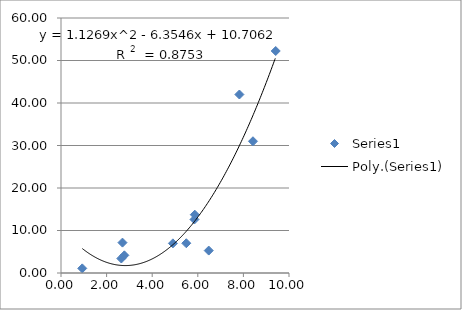
| Category | Series 0 |
|---|---|
| 9.417843782039517 | 52.238 |
| 2.7787925714190087 | 4.153 |
| 5.867924822113039 | 13.723 |
| 5.494446006952862 | 7.002 |
| 6.480009890027376 | 5.278 |
| 4.908011391763387 | 6.976 |
| 7.82460359048088 | 42 |
| 2.6961209458362436 | 7.148 |
| 2.646468097571062 | 3.411 |
| 8.420690197250176 | 31 |
| 5.854275460217746 | 12.592 |
| 0.9322359222228138 | 1.088 |